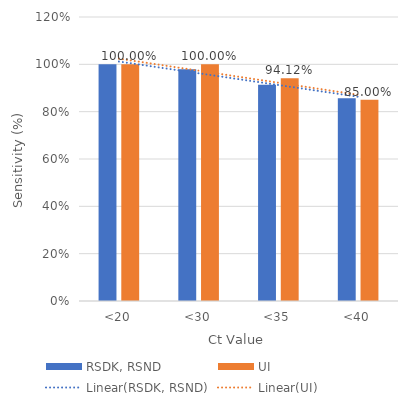
| Category | RSDK, RSND | UI |
|---|---|---|
| <20 | 1 | 1 |
| <30 | 0.98 | 1 |
| <35 | 0.914 | 0.941 |
| <40 | 0.856 | 0.85 |